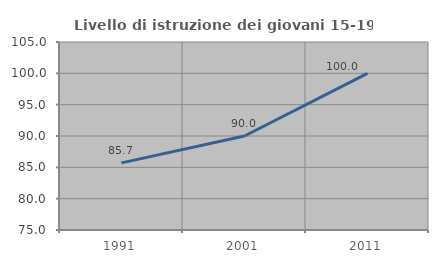
| Category | Livello di istruzione dei giovani 15-19 anni |
|---|---|
| 1991.0 | 85.714 |
| 2001.0 | 90 |
| 2011.0 | 100 |